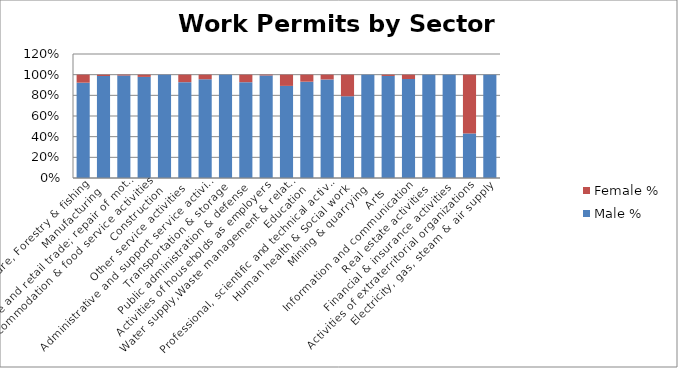
| Category | Male % | Female % |
|---|---|---|
| Agriculture, Forestry & fishing | 0.922 | 0.078 |
|  Manufacturing | 0.987 | 0.013 |
|  Wholesale and retail trade; repair of motor vehicles  | 0.992 | 0.008 |
|   Accommodation & food service activities | 0.978 | 0.022 |
|   Construction | 1 | 0 |
| Other service activities | 0.928 | 0.072 |
| Administrative and support service activities | 0.956 | 0.044 |
|   Transportation & storage | 1 | 0 |
| Public administration & defense | 0.927 | 0.073 |
| Activities of households as employers | 0.992 | 0.008 |
| Water supply,Waste management & related activities | 0.891 | 0.109 |
| Education | 0.932 | 0.068 |
| Professional, scientific and technical activities | 0.954 | 0.046 |
| Human health & Social work | 0.791 | 0.209 |
| Mining & quarrying | 1 | 0 |
| Arts | 0.988 | 0.012 |
|  Information and communication | 0.958 | 0.042 |
| Real estate activities | 1 | 0 |
|  Financial & insurance activities | 1 | 0 |
| Activities of extraterritorial organizations  | 0.431 | 0.569 |
| Electricity, gas, steam & air supply | 1 | 0 |